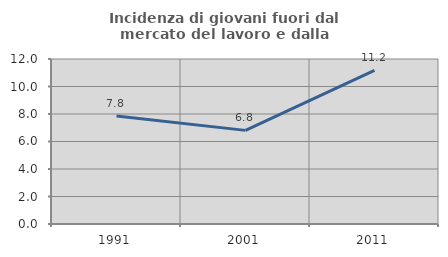
| Category | Incidenza di giovani fuori dal mercato del lavoro e dalla formazione  |
|---|---|
| 1991.0 | 7.85 |
| 2001.0 | 6.809 |
| 2011.0 | 11.17 |